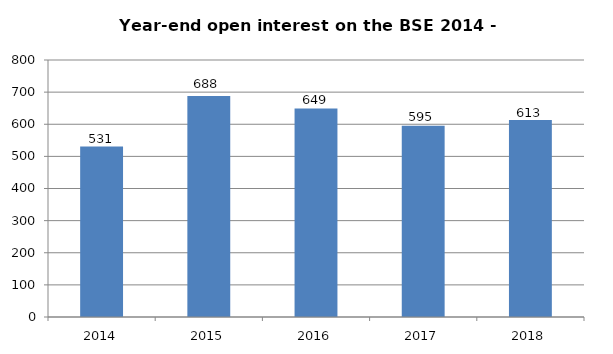
| Category | BSE contracts (thousands) |
|---|---|
| 2014.0 | 531 |
| 2015.0 | 688.194 |
| 2016.0 | 648.876 |
| 2017.0 | 595 |
| 2018.0 | 613 |